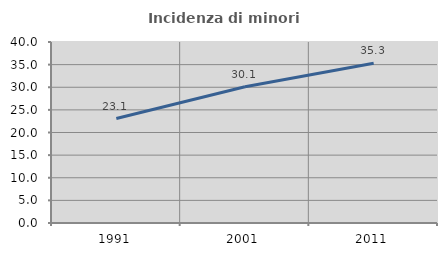
| Category | Incidenza di minori stranieri |
|---|---|
| 1991.0 | 23.077 |
| 2001.0 | 30.097 |
| 2011.0 | 35.294 |